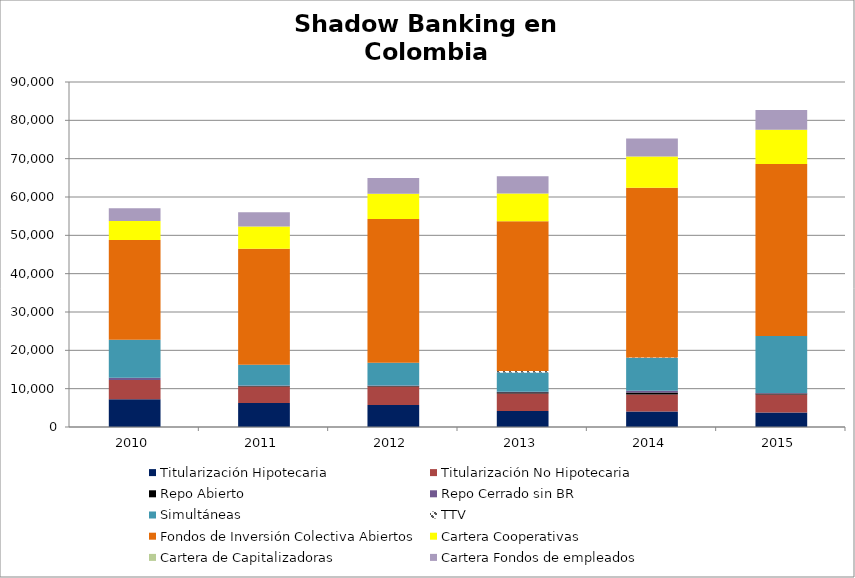
| Category | Titularización Hipotecaria | Titularización No Hipotecaria | Repo Abierto | Repo Cerrado sin BR | Simultáneas | TTV | Fondos de Inversión Colectiva Abiertos | Cartera Cooperativas | Cartera de Capitalizadoras  | Cartera Fondos de empleados |
|---|---|---|---|---|---|---|---|---|---|---|
| 2010-12-31 | 7260.618 | 4998.823 | 4.991 | 606.763 | 9889.131 | 1.192 | 26015.734 | 4965.403 | 21.133 | 3315.689 |
| 2011-12-31 | 6253.704 | 4331.567 | 131.627 | 90.348 | 5416.589 | 0 | 30267.995 | 5804.831 | 23.486 | 3678.085 |
| 2012-12-31 | 5740.879 | 4806.755 | 125.503 | 161.711 | 5905.278 | 0.419 | 37550.669 | 6561.405 | 25.79 | 4062.168 |
| 2013-12-31 | 4190.922 | 4558.285 | 315.833 | 157.929 | 5000.191 | 393.59 | 39072.254 | 7210.063 | 29 | 4507.211 |
| 2014-12-31 | 4045.931 | 4405.423 | 530.977 | 463.758 | 8526.068 | 171.001 | 44284.591 | 8132.259 | 35.523 | 4661.066 |
| 2015-12-31 | 3784.429 | 4713.149 | 272.647 | 103.151 | 14879.208 | 5.893 | 44818.684 | 8936.147 | 34.981 | 5126.704 |